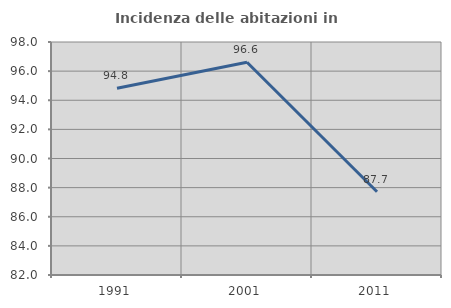
| Category | Incidenza delle abitazioni in proprietà  |
|---|---|
| 1991.0 | 94.819 |
| 2001.0 | 96.61 |
| 2011.0 | 87.719 |